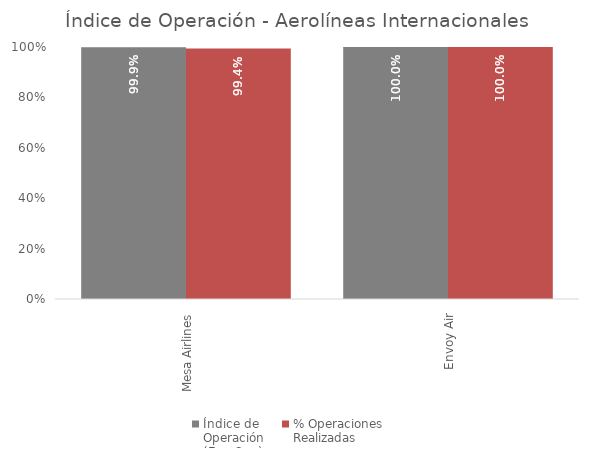
| Category | Índice de 
Operación
(Ene-Sep) | % Operaciones
Realizadas |
|---|---|---|
| Mesa Airlines | 0.999 | 0.994 |
| Envoy Air | 1 | 1 |